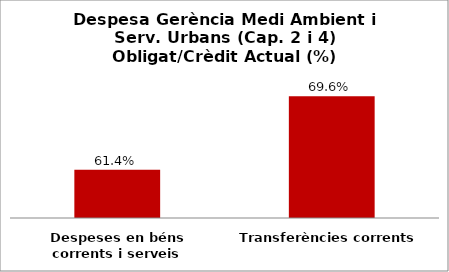
| Category | Series 0 |
|---|---|
| Despeses en béns corrents i serveis | 0.614 |
| Transferències corrents | 0.696 |